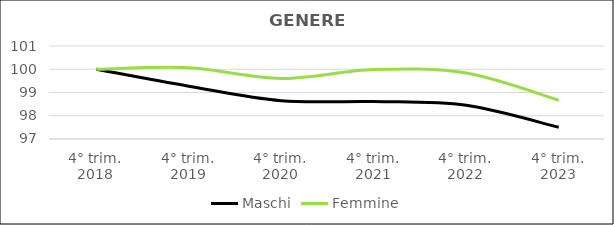
| Category | Maschi | Femmine |
|---|---|---|
| 4° trim.
2018 | 100 | 100 |
| 4° trim.
2019 | 99.271 | 100.066 |
| 4° trim.
2020 | 98.646 | 99.606 |
| 4° trim.
2021 | 98.613 | 99.987 |
| 4° trim.
2022 | 98.447 | 99.836 |
| 4° trim.
2023 | 97.502 | 98.666 |